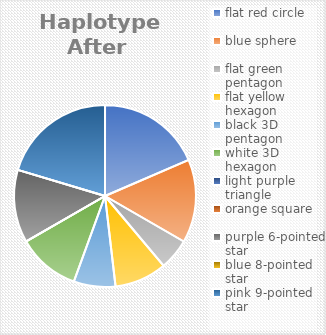
| Category | Series 4 | Series 5 | Series 6 | Series 7 | Series 2 | Series 3 | Series 1 | Series 0 |
|---|---|---|---|---|---|---|---|---|
| flat red circle | 10 | 26 | 15 | 26 | 15 | 26 | 15 | 26 |
| blue sphere | 8 | 24 | 19 | 24 | 19 | 24 | 19 | 24 |
| flat green pentagon | 3 | 13 | 3 | 13 | 3 | 13 | 3 | 13 |
| flat yellow hexagon | 5 | 13 | 13 | 13 | 13 | 13 | 13 | 13 |
| black 3D pentagon | 4 | 10 | 4 | 10 | 4 | 10 | 4 | 10 |
| white 3D hexagon | 6 | 14 | 14 | 14 | 14 | 14 | 14 | 14 |
| light purple triangle | 0 | 7 | 7 | 7 | 7 | 7 | 7 | 7 |
| orange square | 0 | 4 | 0 | 4 | 0 | 4 | 0 | 4 |
| purple 6-pointed star | 7 | 16 | 16 | 16 | 16 | 16 | 16 | 16 |
| blue 8-pointed star | 0 | 12 | 0 | 12 | 0 | 12 | 0 | 12 |
| pink 9-pointed star | 11 | 11 | 11 | 11 | 11 | 11 | 11 | 11 |